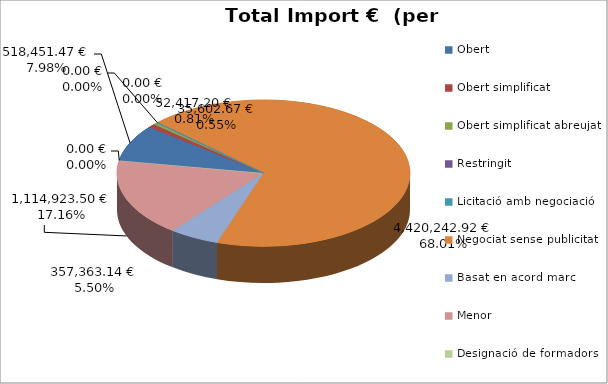
| Category | Total preu              (amb iva) |
|---|---|
| Obert | 518451.47 |
| Obert simplificat | 52417.2 |
| Obert simplificat abreujat | 35602.67 |
| Restringit | 0 |
| Licitació amb negociació | 0 |
| Negociat sense publicitat | 4420242.92 |
| Basat en acord marc | 357363.145 |
| Menor | 1114923.5 |
| Designació de formadors | 0 |